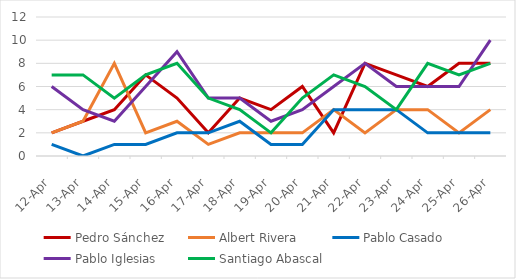
| Category | Pedro Sánchez | Albert Rivera | Pablo Casado | Pablo Iglesias | Santiago Abascal |
|---|---|---|---|---|---|
| 2019-04-12 | 2 | 2 | 1 | 6 | 7 |
| 2019-04-13 | 3 | 3 | 0 | 4 | 7 |
| 2019-04-14 | 4 | 8 | 1 | 3 | 5 |
| 2019-04-15 | 7 | 2 | 1 | 6 | 7 |
| 2019-04-16 | 5 | 3 | 2 | 9 | 8 |
| 2019-04-17 | 2 | 1 | 2 | 5 | 5 |
| 2019-04-18 | 5 | 2 | 3 | 5 | 4 |
| 2019-04-19 | 4 | 2 | 1 | 3 | 2 |
| 2019-04-20 | 6 | 2 | 1 | 4 | 5 |
| 2019-04-21 | 2 | 4 | 4 | 6 | 7 |
| 2019-04-22 | 8 | 2 | 4 | 8 | 6 |
| 2019-04-23 | 7 | 4 | 4 | 6 | 4 |
| 2019-04-24 | 6 | 4 | 2 | 6 | 8 |
| 2019-04-25 | 8 | 2 | 2 | 6 | 7 |
| 2019-04-26 | 8 | 4 | 2 | 10 | 8 |